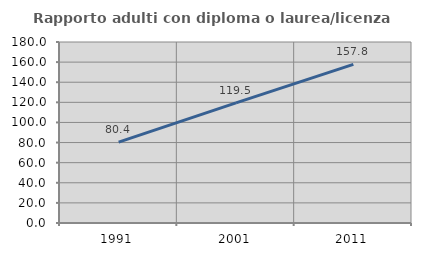
| Category | Rapporto adulti con diploma o laurea/licenza media  |
|---|---|
| 1991.0 | 80.44 |
| 2001.0 | 119.457 |
| 2011.0 | 157.778 |